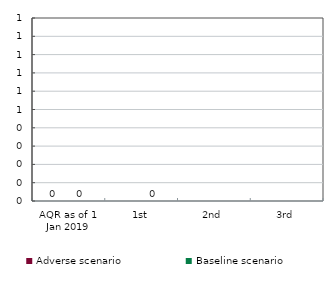
| Category | Adverse scenario | Baseline scenario |
|---|---|---|
| AQR as of 1 Jan 2019 | 0 | 0 |
| 1st | 0 | 0 |
| 2nd | 0 | 0 |
| 3rd | 0 | 0 |